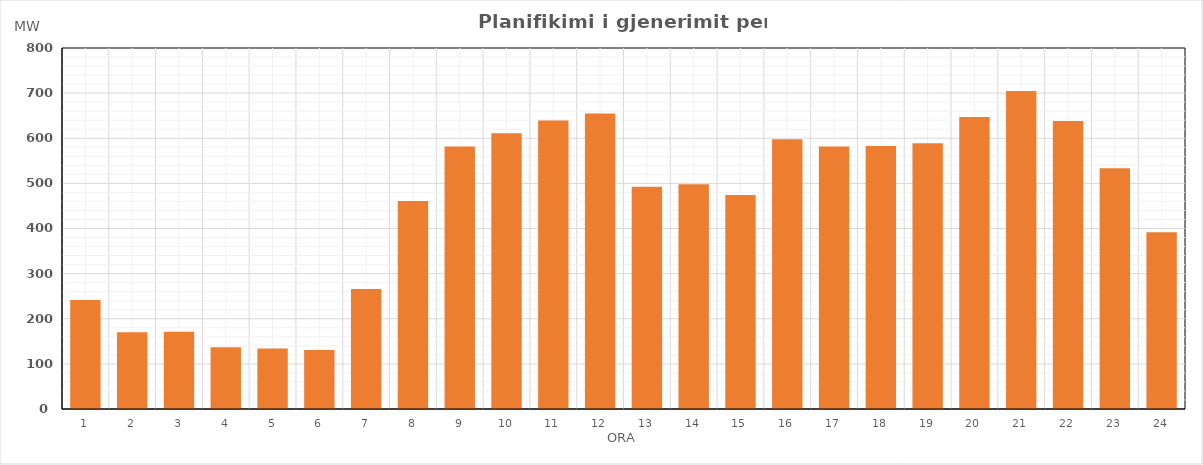
| Category | Max (MW) |
|---|---|
| 0 | 241.344 |
| 1 | 170.15 |
| 2 | 171.15 |
| 3 | 137 |
| 4 | 134 |
| 5 | 131 |
| 6 | 266.109 |
| 7 | 461.018 |
| 8 | 581.78 |
| 9 | 610.989 |
| 10 | 639.069 |
| 11 | 655.059 |
| 12 | 492.263 |
| 13 | 498.329 |
| 14 | 474.189 |
| 15 | 597.854 |
| 16 | 581.729 |
| 17 | 582.749 |
| 18 | 588.753 |
| 19 | 646.819 |
| 20 | 704.954 |
| 21 | 638.059 |
| 22 | 533.514 |
| 23 | 391.849 |